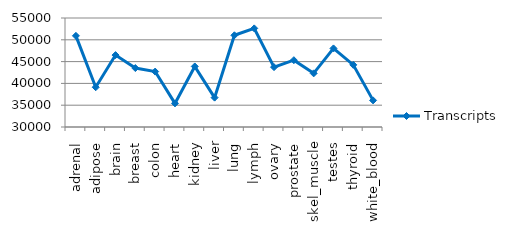
| Category | Transcripts |
|---|---|
| adrenal | 50908 |
| adipose | 39117 |
| brain | 46495 |
| breast | 43517 |
| colon | 42711 |
| heart | 35416 |
| kidney | 43887 |
| liver | 36736 |
| lung | 51034 |
| lymph | 52617 |
| ovary | 43729 |
| prostate | 45321 |
| skel_muscle | 42305 |
| testes | 48025 |
| thyroid | 44250 |
| white_blood | 36106 |